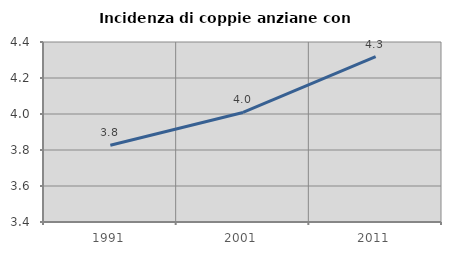
| Category | Incidenza di coppie anziane con figli |
|---|---|
| 1991.0 | 3.827 |
| 2001.0 | 4.008 |
| 2011.0 | 4.319 |